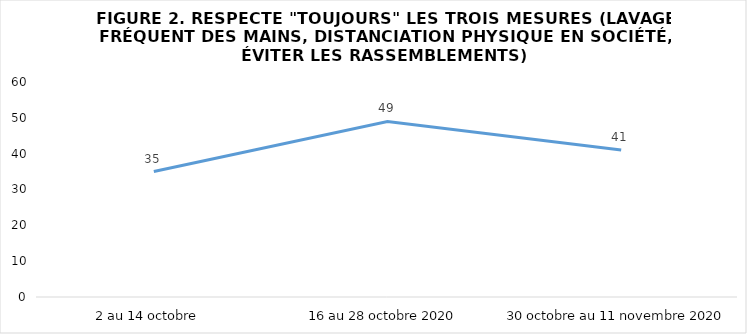
| Category | Series 0 |
|---|---|
| 2 au 14 octobre  | 35 |
| 16 au 28 octobre 2020 | 49 |
| 30 octobre au 11 novembre 2020 | 41 |